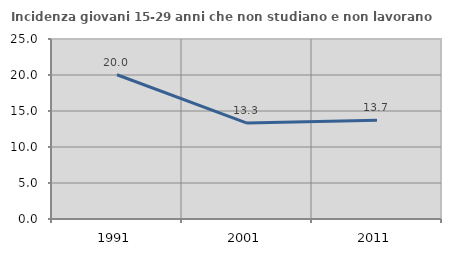
| Category | Incidenza giovani 15-29 anni che non studiano e non lavorano  |
|---|---|
| 1991.0 | 20.031 |
| 2001.0 | 13.318 |
| 2011.0 | 13.723 |